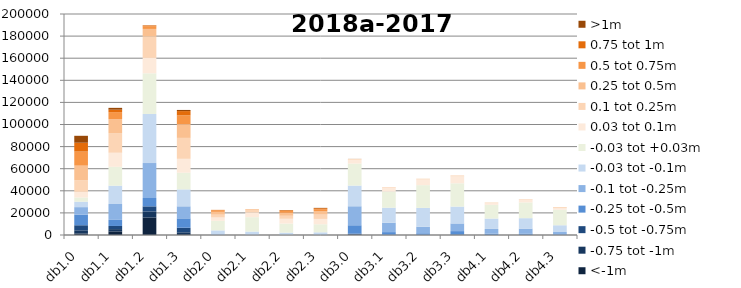
| Category | <-1m | -0.75 tot -1m | -0.5 tot -0.75m | -0.25 tot -0.5m | -0.1 tot -0.25m | -0.03 tot -0.1m | -0.03 tot +0.03m | 0.03 tot 0.1m | 0.1 tot 0.25m | 0.25 tot 0.5m | 0.5 tot 0.75m | 0.75 tot 1m | >1m |
|---|---|---|---|---|---|---|---|---|---|---|---|---|---|
| db1.0 | 1372 | 2856 | 4588 | 9524 | 6882 | 4926 | 3796 | 5149 | 10466 | 13224 | 12718 | 8013 | 6261 |
| db1.1 | 3269 | 2056 | 2849 | 5498 | 14363 | 16566 | 17110 | 12735 | 17795 | 12585 | 6391 | 2201 | 1639 |
| db1.2 | 15792 | 5517 | 4619 | 7579 | 31624 | 44403 | 36788 | 13975 | 19331 | 6865 | 2486 | 667 | 116 |
| db1.3 | 841 | 1593 | 4150 | 8484 | 10880 | 15335 | 15086 | 12573 | 18943 | 12399 | 7965 | 3892 | 1028 |
| db2.0 | 16 | 19 | 36 | 110 | 460 | 3538 | 8645 | 3039 | 2532 | 2579 | 1431 | 329 | 28 |
| db2.1 | 3 | 4 | 32 | 63 | 301 | 2700 | 13012 | 4296 | 2201 | 673 | 54 | 2 | 0 |
| db2.2 | 0 | 0 | 0 | 36 | 311 | 1786 | 8204 | 4337 | 2730 | 2671 | 1627 | 628 | 144 |
| db2.3 | 1 | 4 | 9 | 78 | 397 | 1955 | 7269 | 4831 | 3927 | 2934 | 1943 | 878 | 325 |
| db3.0 | 335 | 117 | 744 | 7624 | 17190 | 18713 | 19895 | 3522 | 518 | 122 | 28 | 9 | 80 |
| db3.1 | 1 | 10 | 168 | 2450 | 8527 | 13544 | 14605 | 3591 | 453 | 60 | 14 | 2 | 0 |
| db3.2 | 5 | 17 | 121 | 1439 | 5928 | 17016 | 20570 | 5210 | 583 | 51 | 4 | 0 | 0 |
| db3.3 | 5 | 40 | 386 | 3098 | 6923 | 15270 | 21057 | 6369 | 686 | 57 | 20 | 6 | 3 |
| db4.1 | 0 | 2 | 69 | 1185 | 4242 | 9387 | 12423 | 1860 | 297 | 42 | 1 | 0 | 0 |
| db4.2 | 3 | 16 | 103 | 1258 | 4413 | 9431 | 14277 | 2527 | 405 | 60 | 11 | 0 | 0 |
| db4.3 | 3 | 20 | 58 | 558 | 2078 | 6095 | 14064 | 1671 | 653 | 101 | 5 | 0 | 0 |